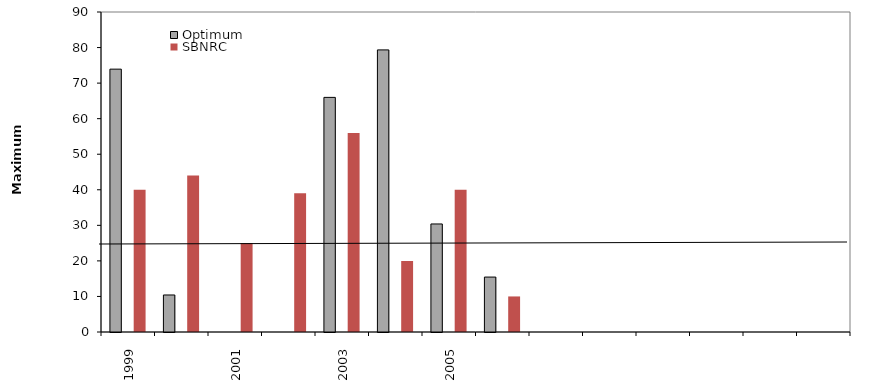
| Category | Optimum  | SBNRC |
|---|---|---|
| 1999.0 | 73.929 | 40 |
| 2000.0 | 10.415 | 44 |
| 2001.0 | 0 | 25 |
| 2002.0 | 0 | 39 |
| 2003.0 | 65.988 | 56 |
| 2004.0 | 79.34 | 20 |
| 2005.0 | 30.387 | 40 |
| 2006.0 | 15.45 | 10 |